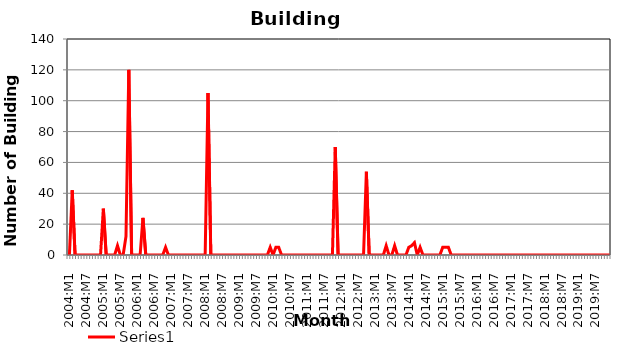
| Category | Series 0 |
|---|---|
| 2004:M1 | 0 |
| 2004:M2 | 42 |
| 2004:M3 | 0 |
| 2004:M4 | 0 |
| 2004:M5 | 0 |
| 2004:M6 | 0 |
| 2004:M7 | 0 |
| 2004:M8 | 0 |
| 2004:M9 | 0 |
| 2004:M10 | 0 |
| 2004:M11 | 0 |
| 2004:M12 | 0 |
| 2005:M1 | 30 |
| 2005:M2 | 0 |
| 2005:M3 | 0 |
| 2005:M4 | 0 |
| 2005:M5 | 0 |
| 2005:M6 | 6 |
| 2005:M7 | 0 |
| 2005:M8 | 0 |
| 2005:M9 | 12 |
| 2005:M10 | 120 |
| 2005:M11 | 0 |
| 2005:M12 | 0 |
| 2006:M1 | 0 |
| 2006:M2 | 0 |
| 2006:M3 | 24 |
| 2006:M4 | 0 |
| 2006:M5 | 0 |
| 2006:M6 | 0 |
| 2006:M7 | 0 |
| 2006:M8 | 0 |
| 2006:M9 | 0 |
| 2006:M10 | 0 |
| 2006:M11 | 5 |
| 2006:M12 | 0 |
| 2007:M1 | 0 |
| 2007:M2 | 0 |
| 2007:M3 | 0 |
| 2007:M4 | 0 |
| 2007:M5 | 0 |
| 2007:M6 | 0 |
| 2007:M7 | 0 |
| 2007:M8 | 0 |
| 2007:M9 | 0 |
| 2007:M10 | 0 |
| 2007:M11 | 0 |
| 2007:M12 | 0 |
| 2008:M1 | 0 |
| 2008:M2 | 105 |
| 2008:M3 | 0 |
| 2008:M4 | 0 |
| 2008:M5 | 0 |
| 2008:M6 | 0 |
| 2008:M7 | 0 |
| 2008:M8 | 0 |
| 2008:M9 | 0 |
| 2008:M10 | 0 |
| 2008:M11 | 0 |
| 2008:M12 | 0 |
| 2009:M1 | 0 |
| 2009:M2 | 0 |
| 2009:M3 | 0 |
| 2009:M4 | 0 |
| 2009:M5 | 0 |
| 2009:M6 | 0 |
| 2009:M7 | 0 |
| 2009:M8 | 0 |
| 2009:M9 | 0 |
| 2009:M10 | 0 |
| 2009:M11 | 0 |
| 2009:M12 | 5 |
| 2010:M1 | 0 |
| 2010:M2 | 5 |
| 2010:M3 | 5 |
| 2010:M4 | 0 |
| 2010:M5 | 0 |
| 2010:M6 | 0 |
| 2010:M7 | 0 |
| 2010:M8 | 0 |
| 2010:M9 | 0 |
| 2010:M10 | 0 |
| 2010:M11 | 0 |
| 2010:M12 | 0 |
| 2011:M1 | 0 |
| 2011:M2 | 0 |
| 2011:M3 | 0 |
| 2011:M4 | 0 |
| 2011:M5 | 0 |
| 2011:M6 | 0 |
| 2011:M7 | 0 |
| 2011:M8 | 0 |
| 2011:M9 | 0 |
| 2011:M10 | 0 |
| 2011:M11 | 70 |
| 2011:M12 | 0 |
| 2012:M1 | 0 |
| 2012:M2 | 0 |
| 2012:M3 | 0 |
| 2012:M4 | 0 |
| 2012:M5 | 0 |
| 2012:M6 | 0 |
| 2012:M7 | 0 |
| 2012:M8 | 0 |
| 2012:M9 | 0 |
| 2012:M10 | 54 |
| 2012:M11 | 0 |
| 2012:M12 | 0 |
| 2013:M1 | 0 |
| 2013:M2 | 0 |
| 2013:M3 | 0 |
| 2013:M4 | 0 |
| 2013:M5 | 6 |
| 2013:M6 | 0 |
| 2013:M7 | 0 |
| 2013:M8 | 6 |
| 2013:M9 | 0 |
| 2013:M10 | 0 |
| 2013:M11 | 0 |
| 2013:M12 | 0 |
| 2014:M1 | 5 |
| 2014:M2 | 6 |
| 2014:M3 | 8 |
| 2014:M4 | 0 |
| 2014:M5 | 5 |
| 2014:M6 | 0 |
| 2014:M7 | 0 |
| 2014:M8 | 0 |
| 2014:M9 | 0 |
| 2014:M10 | 0 |
| 2014:M11 | 0 |
| 2014:M12 | 0 |
| 2015:M1 | 5 |
| 2015:M2 | 5 |
| 2015:M3 | 5 |
| 2015:M4 | 0 |
| 2015:M5 | 0 |
| 2015:M6 | 0 |
| 2015:M7 | 0 |
| 2015:M8 | 0 |
| 2015:M9 | 0 |
| 2015:M10 | 0 |
| 2015:M11 | 0 |
| 2015:M12 | 0 |
| 2016:M1 | 0 |
| 2016:M2 | 0 |
| 2016:M3 | 0 |
| 2016:M4 | 0 |
| 2016:M5 | 0 |
| 2016:M6 | 0 |
| 2016:M7 | 0 |
| 2016:M8 | 0 |
| 2016:M9 | 0 |
| 2016:M10 | 0 |
| 2016:M11 | 0 |
| 2016:M12 | 0 |
| 2017:M1 | 0 |
| 2017:M2 | 0 |
| 2017:M3 | 0 |
| 2017:M4 | 0 |
| 2017:M5 | 0 |
| 2017:M6 | 0 |
| 2017:M7 | 0 |
| 2017:M8 | 0 |
| 2017:M9 | 0 |
| 2017:M10 | 0 |
| 2017:M11 | 0 |
| 2017:M12 | 0 |
| 2018:M1 | 0 |
| 2018:M2 | 0 |
| 2018:M3 | 0 |
| 2018:M4 | 0 |
| 2018:M5 | 0 |
| 2018:M6 | 0 |
| 2018:M7 | 0 |
| 2018:M8 | 0 |
| 2018:M9 | 0 |
| 2018:M10 | 0 |
| 2018:M11 | 0 |
| 2018:M12 | 0 |
| 2019:M1 | 0 |
| 2019:M2 | 0 |
| 2019:M3 | 0 |
| 2019:M4 | 0 |
| 2019:M5 | 0 |
| 2019:M6 | 0 |
| 2019:M7 | 0 |
| 2019:M8 | 0 |
| 2019:M9 | 0 |
| 2019:M10 | 0 |
| 2019:M11 | 0 |
| 2019:M12 | 0 |